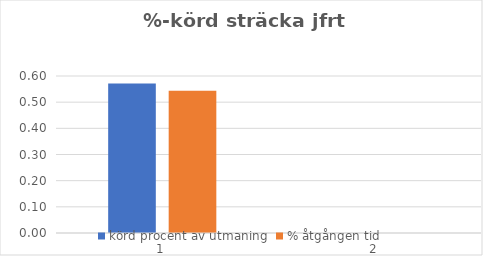
| Category | körd procent av utmaning | % åtgången tid |
|---|---|---|
| 0 | 0.571 | 0.543 |
| 1 | 0 | 0 |